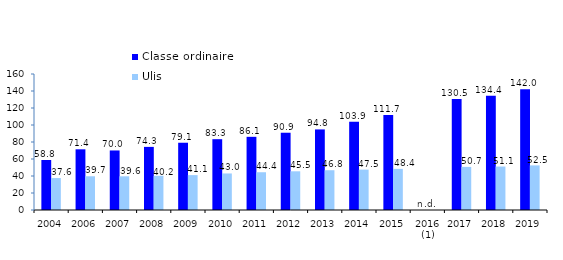
| Category | Classe ordinaire | Ulis |
|---|---|---|
| 2004 | 58.812 | 37.584 |
| 2006 | 71.399 | 39.684 |
| 2007 | 70.048 | 39.634 |
| 2008 | 74.251 | 40.231 |
| 2009 | 79.129 | 41.051 |
| 2010 | 83.309 | 42.985 |
| 2011 | 86.089 | 44.428 |
| 2012 | 90.9 | 45.521 |
| 2013 | 94.8 | 46.8 |
| 2014 | 103.9 | 47.5 |
| 2015 | 111.7 | 48.4 |
| 2016 (1) | 0 | 0 |
| 2017 | 130.506 | 50.7 |
| 2018 | 134.438 | 51.125 |
| 2019 | 142.026 | 52.468 |